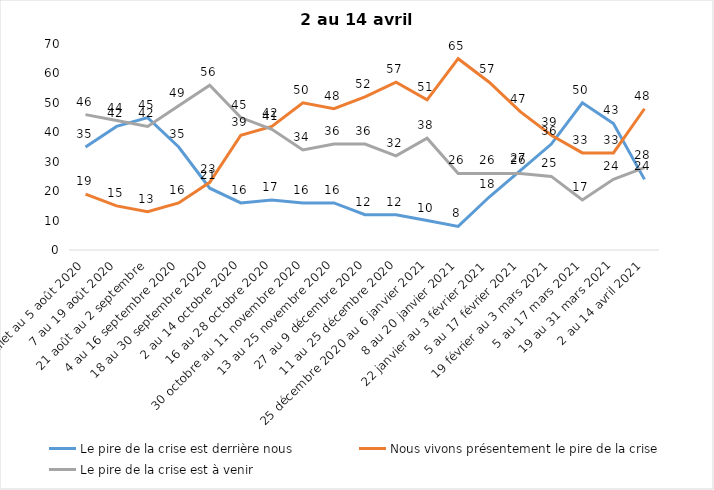
| Category | Le pire de la crise est derrière nous | Nous vivons présentement le pire de la crise | Le pire de la crise est à venir |
|---|---|---|---|
| 24 juillet au 5 août 2020 | 35 | 19 | 46 |
| 7 au 19 août 2020 | 42 | 15 | 44 |
| 21 août au 2 septembre | 45 | 13 | 42 |
| 4 au 16 septembre 2020 | 35 | 16 | 49 |
| 18 au 30 septembre 2020 | 21 | 23 | 56 |
| 2 au 14 octobre 2020 | 16 | 39 | 45 |
| 16 au 28 octobre 2020 | 17 | 42 | 41 |
| 30 octobre au 11 novembre 2020 | 16 | 50 | 34 |
| 13 au 25 novembre 2020 | 16 | 48 | 36 |
| 27 au 9 décembre 2020 | 12 | 52 | 36 |
| 11 au 25 décembre 2020 | 12 | 57 | 32 |
| 25 décembre 2020 au 6 janvier 2021 | 10 | 51 | 38 |
| 8 au 20 janvier 2021 | 8 | 65 | 26 |
| 22 janvier au 3 février 2021 | 18 | 57 | 26 |
| 5 au 17 février 2021 | 27 | 47 | 26 |
| 19 février au 3 mars 2021 | 36 | 39 | 25 |
| 5 au 17 mars 2021 | 50 | 33 | 17 |
| 19 au 31 mars 2021 | 43 | 33 | 24 |
| 2 au 14 avril 2021 | 24 | 48 | 28 |